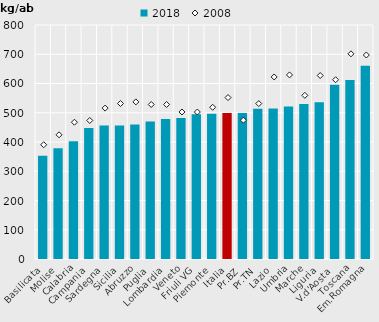
| Category | 2018 |
|---|---|
| Basilicata | 352.968 |
| Molise | 379.056 |
| Calabria | 402.383 |
| Campania | 447.652 |
| Sardegna | 456.205 |
| Sicilia | 456.62 |
| Abruzzo | 459.54 |
| Puglia | 469.81 |
| Lombardia | 478.78 |
| Veneto | 481.757 |
| Friuli VG | 494.692 |
| Piemonte | 496.565 |
| Italia | 499.233 |
| Pr.BZ | 499.445 |
| Pr.TN | 514.039 |
| Lazio | 514.149 |
| Umbria | 521.197 |
| Marche | 530.004 |
| Liguria | 535.672 |
| V.d'Aosta | 595.991 |
| Toscana | 611.829 |
| Em.Romagna | 660.964 |